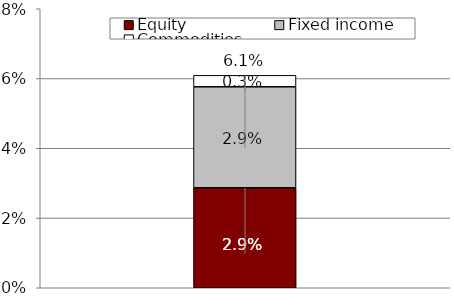
| Category | Equity  | Fixed income | Commodities |
|---|---|---|---|
| 0 | 0.029 | 0.029 | 0.003 |